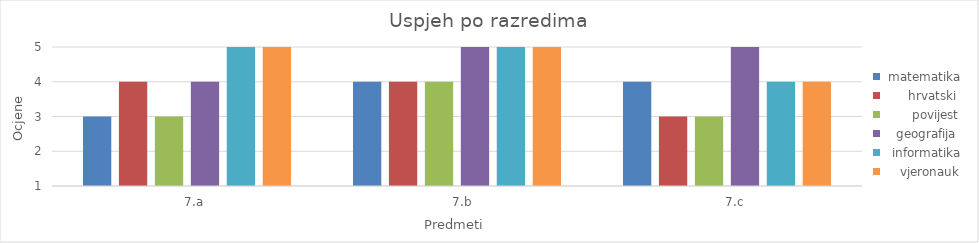
| Category |  matematika |       hrvatski |        povijest |    geografija |   informatika |     vjeronauk |
|---|---|---|---|---|---|---|
|     7.a | 3 | 4 | 3 | 4 | 5 | 5 |
|     7.b  | 4 | 4 | 4 | 5 | 5 | 5 |
|     7.c | 4 | 3 | 3 | 5 | 4 | 4 |